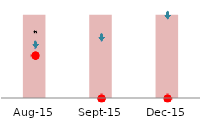
| Category | Series 1 |
|---|---|
| 2015-08-01 | 346.73 |
| 2015-09-01 | 346.73 |
| 2015-12-01 | 346.73 |